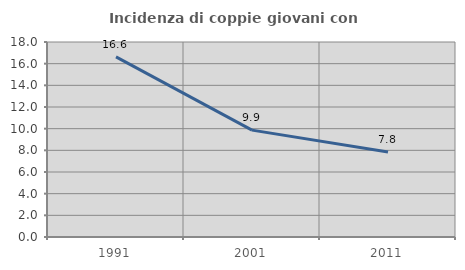
| Category | Incidenza di coppie giovani con figli |
|---|---|
| 1991.0 | 16.622 |
| 2001.0 | 9.866 |
| 2011.0 | 7.837 |